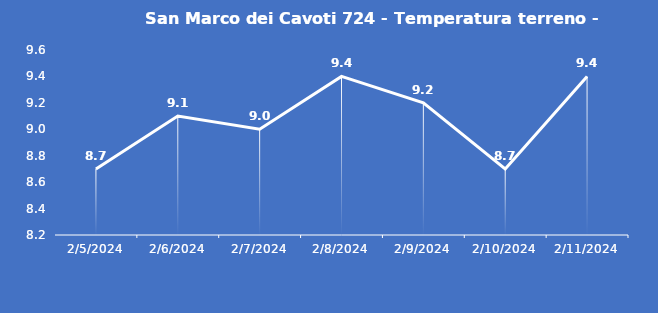
| Category | San Marco dei Cavoti 724 - Temperatura terreno - Grezzo (°C) |
|---|---|
| 2/5/24 | 8.7 |
| 2/6/24 | 9.1 |
| 2/7/24 | 9 |
| 2/8/24 | 9.4 |
| 2/9/24 | 9.2 |
| 2/10/24 | 8.7 |
| 2/11/24 | 9.4 |